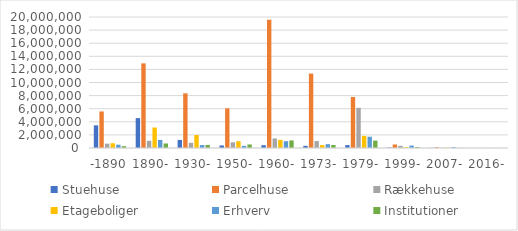
| Category | Stuehuse | Parcelhuse | Rækkehuse | Etageboliger | Erhverv | Institutioner |
|---|---|---|---|---|---|---|
| -1890 | 3459714.248 | 5582554.859 | 665671.714 | 727427.3 | 501737.254 | 279805.689 |
| 1890- | 4566272.673 | 12922164.332 | 1097358.421 | 3126023.519 | 1231664.266 | 689461.161 |
| 1930- | 1230320.186 | 8347414.248 | 791614.059 | 1995507.62 | 449394.175 | 463925.469 |
| 1950- | 397287.096 | 6056848.403 | 866838.916 | 1039288.55 | 326800.808 | 540039.556 |
| 1960- | 432212.446 | 19592188.658 | 1462421.51 | 1249233.718 | 1039038.42 | 1151744.86 |
| 1973- | 329205.502 | 11360295.739 | 1064425.744 | 447030.029 | 585609.321 | 456599.116 |
| 1979- | 444950.479 | 7791618.812 | 6136859.542 | 1848677.021 | 1722299.232 | 1126797.765 |
| 1999- | 70147.636 | 533670.195 | 327978.509 | 139517.327 | 371912.655 | 144602.514 |
| 2007- | 14356.296 | 112918.926 | 52343.911 | 49138.582 | 131941.273 | 22344.325 |
| 2016- | 421.827 | 150.102 | 0 | 0 | 8251.38 | 0 |